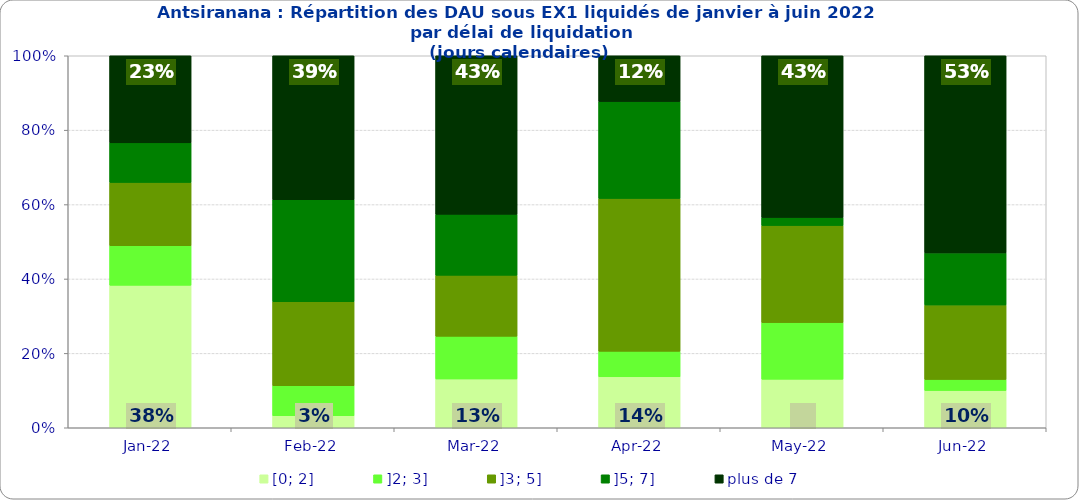
| Category | [0; 2] | ]2; 3] | ]3; 5] | ]5; 7] | plus de 7 |
|---|---|---|---|---|---|
| 2022-01-01 | 0.383 | 0.106 | 0.17 | 0.106 | 0.234 |
| 2022-02-01 | 0.032 | 0.081 | 0.226 | 0.274 | 0.387 |
| 2022-03-01 | 0.131 | 0.115 | 0.164 | 0.164 | 0.426 |
| 2022-04-01 | 0.137 | 0.068 | 0.411 | 0.26 | 0.123 |
| 2022-05-01 | 0.13 | 0.152 | 0.261 | 0.022 | 0.435 |
| 2022-06-01 | 0.1 | 0.03 | 0.2 | 0.14 | 0.53 |